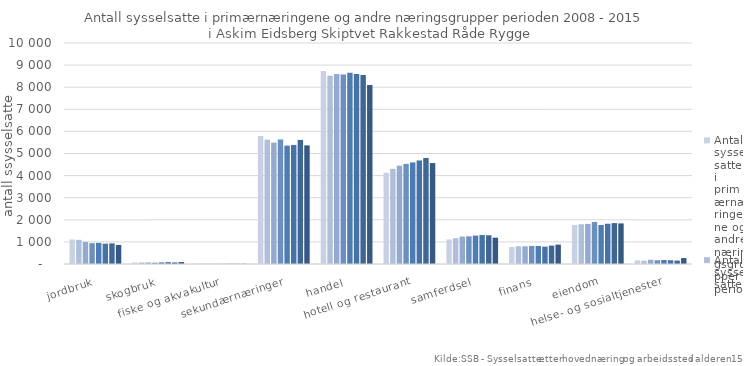
| Category | 2008 | 2009 | 2010 | 2011 | 2012 | 2013 | 2014 | 2015 |
|---|---|---|---|---|---|---|---|---|
| jordbruk | 1110 | 1093 | 997 | 942 | 954 | 920 | 932 | 861 |
| skogbruk | 70 | 71 | 71 | 58 | 73 | 85 | 70 | 88 |
| fiske og akvakultur | 16 | 12 | 9 | 9 | 10 | 13 | 11 | 10 |
| sekundærnæringer | 5790 | 5626 | 5492 | 5636 | 5358 | 5387 | 5616 | 5368 |
| handel, hotell og restaurant, samferdsel, finans, eiendom | 8732 | 8520 | 8593 | 8576 | 8652 | 8594 | 8548 | 8096 |
| helse- og sosialtjenester | 4128 | 4308 | 4451 | 4532 | 4596 | 4686 | 4798 | 4567 |
| off.adm., forsvar, sosialforsikring | 1111 | 1166 | 1242 | 1251 | 1285 | 1310 | 1300 | 1192 |
| personlig tjenesteyting | 773 | 804 | 801 | 819 | 814 | 786 | 832 | 875 |
| undervisning | 1766 | 1800 | 1814 | 1901 | 1765 | 1821 | 1850 | 1837 |
| uoppgitt | 167 | 147 | 192 | 169 | 181 | 171 | 154 | 269 |